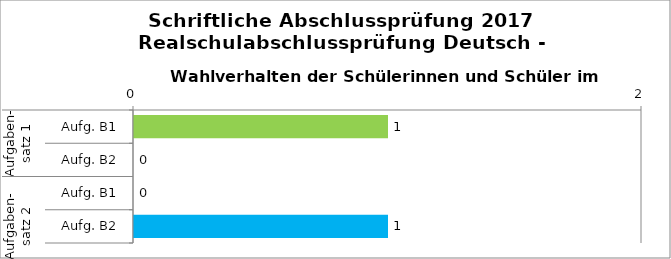
| Category | Series 0 |
|---|---|
| 0 | 1 |
| 1 | 0 |
| 2 | 0 |
| 3 | 1 |